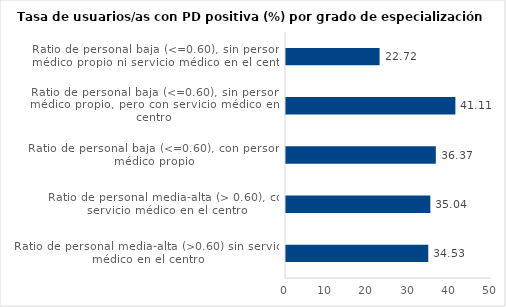
| Category | Series 0 |
|---|---|
| Ratio de personal media-alta (>0.60) sin servicio médico en el centro | 34.532 |
| Ratio de personal media-alta (> 0.60), con servicio médico en el centro | 35.035 |
| Ratio de personal baja (<=0.60), con personal médico propio | 36.367 |
| Ratio de personal baja (<=0.60), sin personal médico propio, pero con servicio médico en el centro | 41.113 |
| Ratio de personal baja (<=0.60), sin personal médico propio ni servicio médico en el centro | 22.715 |